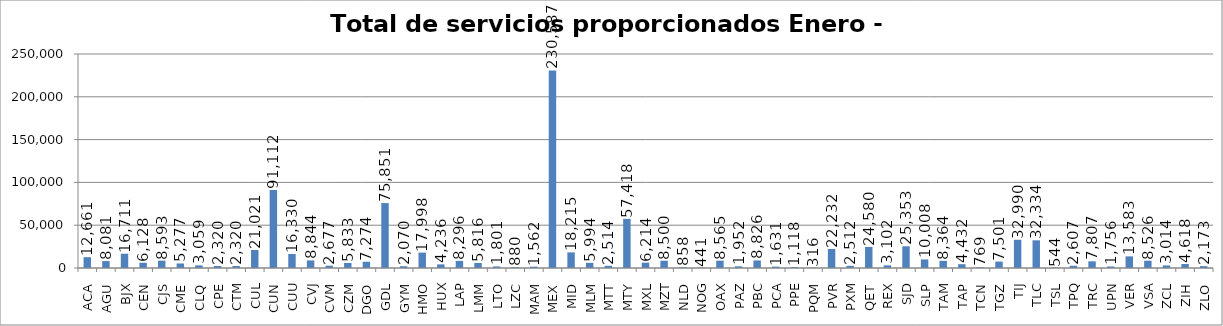
| Category | Total de servicios proporcionados Enero - Diciembre |
|---|---|
| ACA | 12661 |
| AGU | 8081 |
| BJX | 16711 |
| CEN | 6128 |
| CJS | 8593 |
| CME | 5277 |
| CLQ | 3059 |
| CPE | 2320 |
| CTM | 2320 |
| CUL | 21021 |
| CUN | 91112 |
| CUU | 16330 |
| CVJ | 8844 |
| CVM | 2677 |
| CZM | 5833 |
| DGO | 7274 |
| GDL | 75851 |
| GYM | 2070 |
| HMO | 17998 |
| HUX | 4236 |
| LAP | 8296 |
| LMM | 5816 |
| LTO | 1801 |
| LZC | 880 |
| MAM | 1562 |
| MEX | 230587 |
| MID | 18215 |
| MLM | 5994 |
| MTT | 2514 |
| MTY | 57418 |
| MXL | 6214 |
| MZT | 8500 |
| NLD | 858 |
| NOG | 441 |
| OAX | 8565 |
| PAZ | 1952 |
| PBC | 8826 |
| PCA | 1631 |
| PPE | 1118 |
| PQM | 316 |
| PVR | 22232 |
| PXM | 2512 |
| QET | 24580 |
| REX | 3102 |
| SJD | 25353 |
| SLP | 10008 |
| TAM | 8364 |
| TAP | 4432 |
| TCN | 769 |
| TGZ | 7501 |
| TIJ | 32990 |
| TLC | 32334 |
| TSL | 544 |
| TPQ | 2607 |
| TRC | 7807 |
| UPN | 1756 |
| VER | 13583 |
| VSA | 8526 |
| ZCL | 3014 |
| ZIH | 4618 |
| ZLO | 2173 |